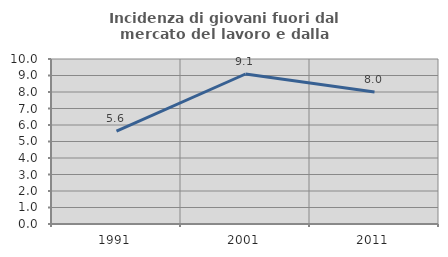
| Category | Incidenza di giovani fuori dal mercato del lavoro e dalla formazione  |
|---|---|
| 1991.0 | 5.634 |
| 2001.0 | 9.091 |
| 2011.0 | 8 |